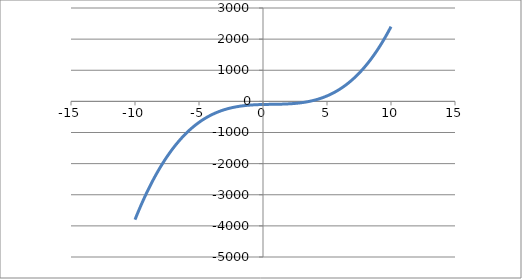
| Category | Series 0 |
|---|---|
| -10.0 | -3800 |
| -9.9 | -3697.957 |
| -9.8 | -3597.816 |
| -9.7 | -3499.559 |
| -9.6 | -3403.168 |
| -9.5 | -3308.625 |
| -9.4 | -3215.912 |
| -9.3 | -3125.011 |
| -9.2 | -3035.904 |
| -9.1 | -2948.573 |
| -9.0 | -2863 |
| -8.9 | -2779.167 |
| -8.8 | -2697.056 |
| -8.7 | -2616.649 |
| -8.6 | -2537.928 |
| -8.50000000000001 | -2460.875 |
| -8.40000000000001 | -2385.472 |
| -8.30000000000001 | -2311.701 |
| -8.20000000000001 | -2239.544 |
| -8.10000000000001 | -2168.983 |
| -8.00000000000001 | -2100 |
| -7.90000000000001 | -2032.577 |
| -7.80000000000001 | -1966.696 |
| -7.70000000000001 | -1902.339 |
| -7.60000000000001 | -1839.488 |
| -7.50000000000001 | -1778.125 |
| -7.40000000000001 | -1718.232 |
| -7.30000000000001 | -1659.791 |
| -7.20000000000001 | -1602.784 |
| -7.10000000000001 | -1547.193 |
| -7.00000000000001 | -1493 |
| -6.90000000000001 | -1440.187 |
| -6.80000000000001 | -1388.736 |
| -6.70000000000001 | -1338.629 |
| -6.60000000000001 | -1289.848 |
| -6.50000000000001 | -1242.375 |
| -6.40000000000001 | -1196.192 |
| -6.30000000000001 | -1151.281 |
| -6.20000000000001 | -1107.624 |
| -6.10000000000001 | -1065.203 |
| -6.00000000000001 | -1024 |
| -5.90000000000001 | -983.997 |
| -5.80000000000001 | -945.176 |
| -5.70000000000002 | -907.519 |
| -5.60000000000002 | -871.008 |
| -5.50000000000002 | -835.625 |
| -5.40000000000002 | -801.352 |
| -5.30000000000002 | -768.171 |
| -5.20000000000002 | -736.064 |
| -5.10000000000002 | -705.013 |
| -5.00000000000002 | -675 |
| -4.90000000000002 | -646.007 |
| -4.80000000000002 | -618.016 |
| -4.70000000000002 | -591.009 |
| -4.60000000000002 | -564.968 |
| -4.50000000000002 | -539.875 |
| -4.40000000000002 | -515.712 |
| -4.30000000000002 | -492.461 |
| -4.20000000000002 | -470.104 |
| -4.10000000000002 | -448.623 |
| -4.00000000000002 | -428 |
| -3.90000000000002 | -408.217 |
| -3.80000000000002 | -389.256 |
| -3.70000000000002 | -371.099 |
| -3.60000000000002 | -353.728 |
| -3.50000000000002 | -337.125 |
| -3.40000000000002 | -321.272 |
| -3.30000000000002 | -306.151 |
| -3.20000000000002 | -291.744 |
| -3.10000000000002 | -278.033 |
| -3.00000000000002 | -265 |
| -2.90000000000003 | -252.627 |
| -2.80000000000003 | -240.896 |
| -2.70000000000003 | -229.789 |
| -2.60000000000003 | -219.288 |
| -2.50000000000003 | -209.375 |
| -2.40000000000003 | -200.032 |
| -2.30000000000003 | -191.241 |
| -2.20000000000003 | -182.984 |
| -2.10000000000003 | -175.243 |
| -2.00000000000003 | -168 |
| -1.90000000000003 | -161.237 |
| -1.80000000000003 | -154.936 |
| -1.70000000000003 | -149.079 |
| -1.60000000000003 | -143.648 |
| -1.50000000000003 | -138.625 |
| -1.40000000000003 | -133.992 |
| -1.30000000000003 | -129.731 |
| -1.20000000000003 | -125.824 |
| -1.10000000000003 | -122.253 |
| -1.00000000000003 | -119 |
| -0.900000000000031 | -116.047 |
| -0.800000000000029 | -113.376 |
| -0.700000000000029 | -110.969 |
| -0.60000000000003 | -108.808 |
| -0.50000000000003 | -106.875 |
| -0.400000000000031 | -105.152 |
| -0.300000000000029 | -103.621 |
| -0.200000000000029 | -102.264 |
| -0.100000000000041 | -101.063 |
| -4.08562073062058e-14 | -100 |
| 0.0999999999999996 | -99.057 |
| 0.199999999999999 | -98.216 |
| 0.300000000000001 | -97.459 |
| 0.4 | -96.768 |
| 0.5 | -96.125 |
| 0.6 | -95.512 |
| 0.699999999999999 | -94.911 |
| 0.800000000000001 | -94.304 |
| 0.9 | -93.673 |
| 1.0 | -93 |
| 1.1 | -92.267 |
| 1.2 | -91.456 |
| 1.3 | -90.549 |
| 1.4 | -89.528 |
| 1.5 | -88.375 |
| 1.6 | -87.072 |
| 1.7 | -85.601 |
| 1.8 | -83.944 |
| 1.9 | -82.083 |
| 2.0 | -80 |
| 2.1 | -77.677 |
| 2.2 | -75.096 |
| 2.3 | -72.239 |
| 2.4 | -69.088 |
| 2.5 | -65.625 |
| 2.6 | -61.832 |
| 2.7 | -57.691 |
| 2.8 | -53.184 |
| 2.9 | -48.293 |
| 3.0 | -43 |
| 3.1 | -37.287 |
| 3.2 | -31.136 |
| 3.3 | -24.529 |
| 3.4 | -17.448 |
| 3.5 | -9.875 |
| 3.6 | -1.792 |
| 3.7 | 6.819 |
| 3.8 | 15.976 |
| 3.9 | 25.697 |
| 4.0 | 36 |
| 4.0999999999999 | 46.903 |
| 4.1999999999999 | 58.424 |
| 4.2999999999999 | 70.581 |
| 4.3999999999999 | 83.392 |
| 4.4999999999999 | 96.875 |
| 4.5999999999999 | 111.048 |
| 4.6999999999999 | 125.929 |
| 4.7999999999999 | 141.536 |
| 4.8999999999999 | 157.887 |
| 4.9999999999999 | 175 |
| 5.0999999999999 | 192.893 |
| 5.1999999999999 | 211.584 |
| 5.2999999999999 | 231.091 |
| 5.3999999999999 | 251.432 |
| 5.4999999999999 | 272.625 |
| 5.5999999999999 | 294.688 |
| 5.6999999999999 | 317.639 |
| 5.7999999999999 | 341.496 |
| 5.8999999999999 | 366.277 |
| 5.9999999999999 | 392 |
| 6.0999999999999 | 418.683 |
| 6.1999999999999 | 446.344 |
| 6.2999999999999 | 475.001 |
| 6.3999999999999 | 504.672 |
| 6.4999999999999 | 535.375 |
| 6.5999999999999 | 567.128 |
| 6.6999999999999 | 599.949 |
| 6.7999999999999 | 633.856 |
| 6.8999999999999 | 668.867 |
| 6.9999999999999 | 705 |
| 7.0999999999999 | 742.273 |
| 7.1999999999999 | 780.704 |
| 7.2999999999999 | 820.311 |
| 7.3999999999999 | 861.112 |
| 7.4999999999999 | 903.125 |
| 7.5999999999999 | 946.368 |
| 7.6999999999999 | 990.859 |
| 7.7999999999999 | 1036.616 |
| 7.8999999999999 | 1083.657 |
| 7.9999999999999 | 1132 |
| 8.0999999999999 | 1181.663 |
| 8.1999999999999 | 1232.664 |
| 8.2999999999999 | 1285.021 |
| 8.3999999999999 | 1338.752 |
| 8.4999999999999 | 1393.875 |
| 8.5999999999999 | 1450.408 |
| 8.6999999999999 | 1508.369 |
| 8.7999999999999 | 1567.776 |
| 8.8999999999999 | 1628.647 |
| 8.9999999999999 | 1691 |
| 9.0999999999999 | 1754.853 |
| 9.1999999999999 | 1820.224 |
| 9.2999999999999 | 1887.131 |
| 9.3999999999999 | 1955.592 |
| 9.4999999999999 | 2025.625 |
| 9.5999999999999 | 2097.248 |
| 9.6999999999999 | 2170.479 |
| 9.7999999999999 | 2245.336 |
| 9.8999999999999 | 2321.837 |
| 9.9999999999999 | 2400 |